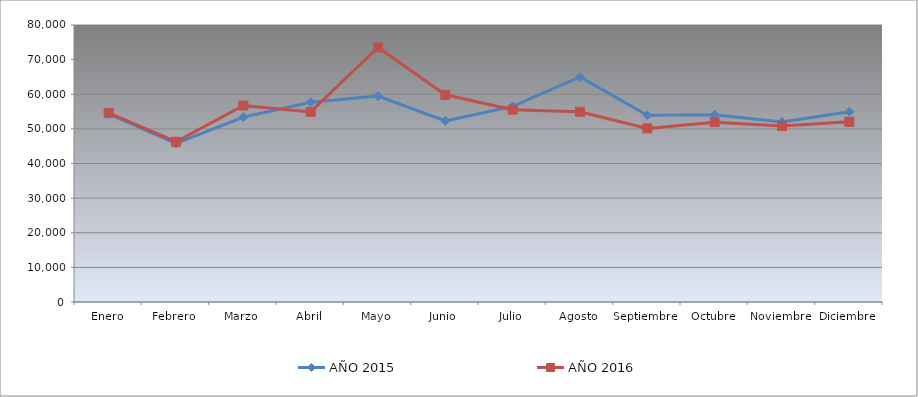
| Category | AÑO 2015 | AÑO 2016 |
|---|---|---|
| Enero | 54298.333 | 54629.877 |
| Febrero | 45792.571 | 46285.799 |
| Marzo | 53388.816 | 56755.067 |
| Abril | 57699.283 | 54899.901 |
| Mayo | 59484.443 | 73501.561 |
| Junio | 52315.01 | 59833.675 |
| Julio | 56491.675 | 55548.292 |
| Agosto | 64988.969 | 54946.572 |
| Septiembre | 53937.575 | 50141.143 |
| Octubre | 54081.54 | 51937.97 |
| Noviembre | 51988.126 | 50846.206 |
| Diciembre | 54969.038 | 52022.977 |